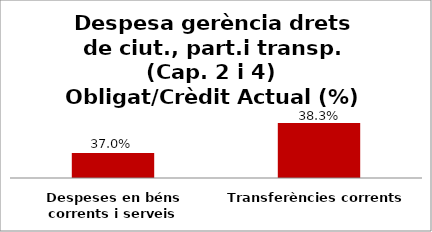
| Category | Series 0 |
|---|---|
| Despeses en béns corrents i serveis | 0.37 |
| Transferències corrents | 0.383 |